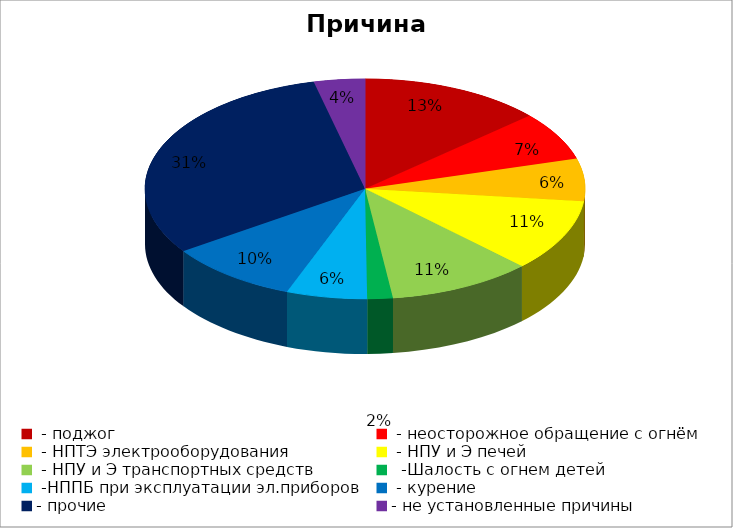
| Category | Причина пожара |
|---|---|
|  - поджог | 43 |
|  - неосторожное обращение с огнём | 23 |
|  - НПТЭ электрооборудования | 20 |
|  - НПУ и Э печей | 34 |
|  - НПУ и Э транспортных средств | 34 |
|   -Шалость с огнем детей | 6 |
|  -НППБ при эксплуатации эл.приборов | 19 |
|  - курение | 31 |
| - прочие | 99 |
| - не установленные причины | 12 |